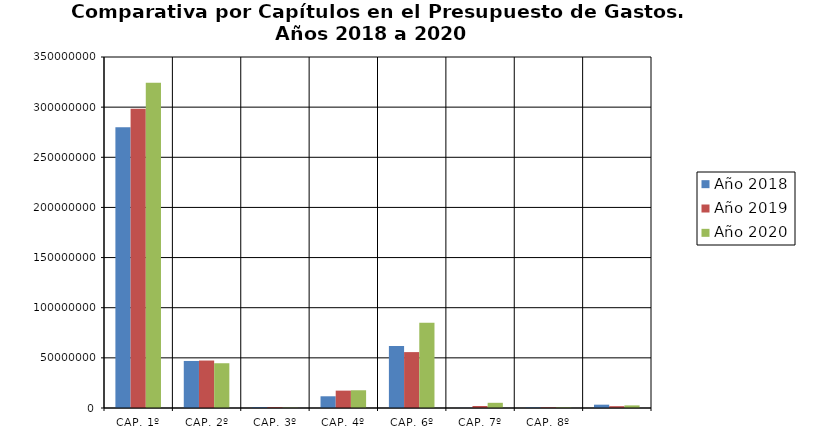
| Category | Año 2018 | Año 2019 | Año 2020 |
|---|---|---|---|
| CAP. 1º | 279917912.12 | 298492474.121 | 324243504.538 |
| CAP. 2º | 46901391.19 | 47334443.08 | 44631588.078 |
| CAP. 3º | 900000 | 900750.435 | 400750 |
| CAP. 4º | 11684980.05 | 17323020.39 | 17680952 |
| CAP. 6º | 61779463.465 | 55737477.32 | 84969041.66 |
| CAP. 7º | 149713 | 1989200.49 | 5186000 |
| CAP. 8º | 649999.7 | 649999.7 | 650000 |